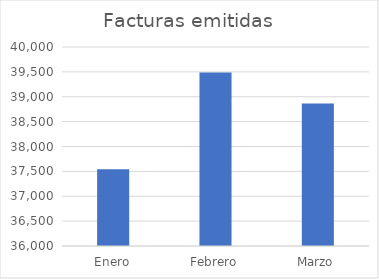
| Category | Facturas emitidas |
|---|---|
| Enero | 37545 |
| Febrero | 39487 |
| Marzo | 38864 |